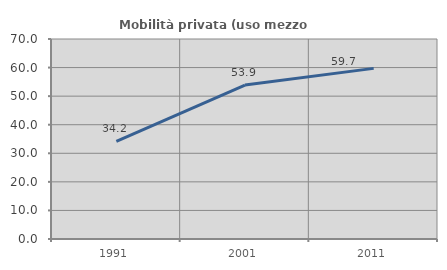
| Category | Mobilità privata (uso mezzo privato) |
|---|---|
| 1991.0 | 34.168 |
| 2001.0 | 53.881 |
| 2011.0 | 59.719 |